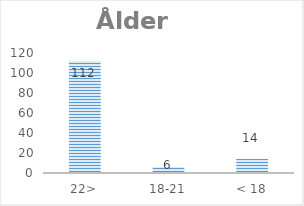
| Category | Series 0 |
|---|---|
| 22> | 112 |
| 18-21 | 6 |
| < 18 | 14 |